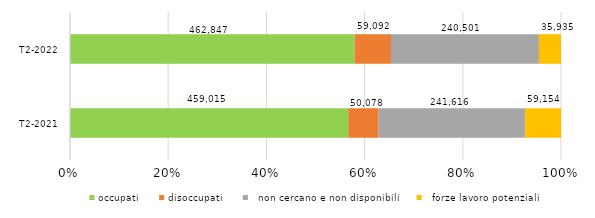
| Category | occupati | disoccupati |   non cercano e non disponibili |   forze lavoro potenziali |
|---|---|---|---|---|
|   T2-2021 | 459015 | 50078 | 241616 | 59154 |
|   T2-2022 | 462847 | 59092 | 240501 | 35935 |